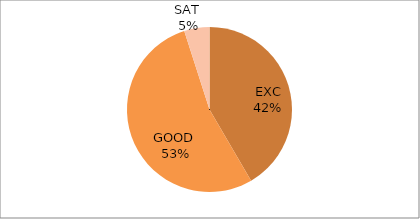
| Category | Series 0 |
|---|---|
| EXC | 42 |
| GOOD  | 54 |
| SAT  | 5 |